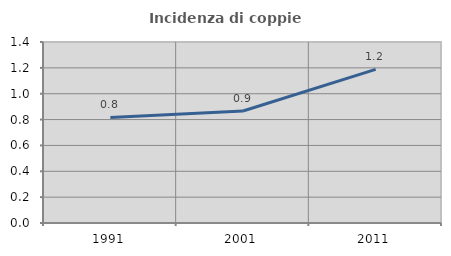
| Category | Incidenza di coppie miste |
|---|---|
| 1991.0 | 0.816 |
| 2001.0 | 0.867 |
| 2011.0 | 1.188 |